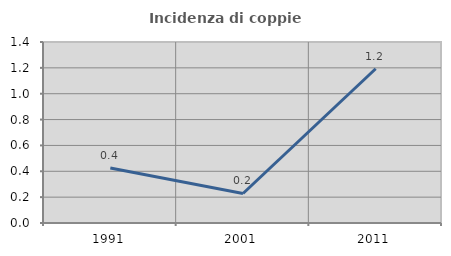
| Category | Incidenza di coppie miste |
|---|---|
| 1991.0 | 0.426 |
| 2001.0 | 0.228 |
| 2011.0 | 1.193 |